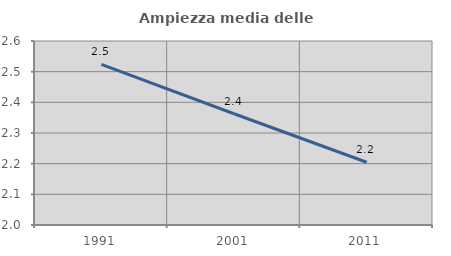
| Category | Ampiezza media delle famiglie |
|---|---|
| 1991.0 | 2.524 |
| 2001.0 | 2.363 |
| 2011.0 | 2.205 |